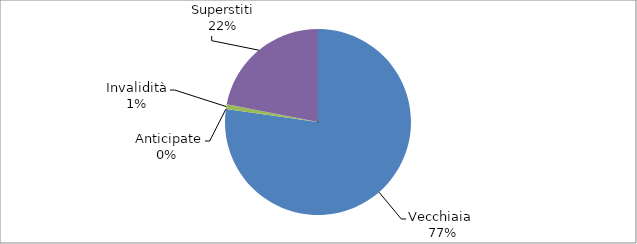
| Category | Series 0 |
|---|---|
| Vecchiaia  | 27955 |
|  Anticipate | 0 |
| Invalidità | 310 |
| Superstiti | 7937 |